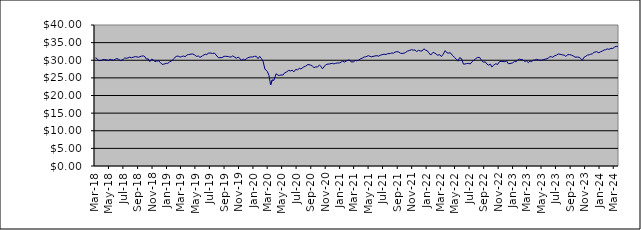
| Category | Series 0 |
|---|---|
| 2014-01-09 | 23.271 |
| 2014-01-17 | 23.331 |
| 2014-01-23 | 23.38 |
| 2014-01-31 | 23.105 |
| 2014-02-10 | 23.154 |
| 2014-02-14 | 23.363 |
| 2014-02-20 | 23.414 |
| 2014-02-28 | 23.655 |
| 2014-03-10 | 23.796 |
| 2014-03-14 | 23.57 |
| 2014-03-20 | 23.682 |
| 2014-03-26 | 23.679 |
| 2014-03-31 | 23.619 |
| 2014-04-09 | 23.552 |
| 2014-04-15 | 23.391 |
| 2014-04-24 | 23.719 |
| 2014-04-30 | 23.696 |
| 2014-05-08 | 23.728 |
| 2014-05-16 | 23.706 |
| 2014-05-22 | 23.804 |
| 2014-05-31 | 24.105 |
| 2014-06-09 | 24.218 |
| 2014-06-16 | 24.162 |
| 2014-06-20 | 24.297 |
| 2014-06-30 | 24.393 |
| 2014-07-09 | 24.436 |
| 2014-07-15 | 24.508 |
| 2014-07-22 | 24.479 |
| 2014-07-31 | 24.432 |
| 2014-08-11 | 24.205 |
| 2014-08-14 | 24.276 |
| 2014-08-21 | 24.601 |
| 2014-08-30 | 24.716 |
| 2014-09-08 | 24.748 |
| 2014-09-16 | 24.609 |
| 2014-09-23 | 24.611 |
| 2014-09-30 | 24.533 |
| 2014-10-09 | 24.479 |
| 2014-10-16 | 23.843 |
| 2014-10-23 | 24.237 |
| 2014-10-31 | 24.693 |
| 2014-11-10 | 24.904 |
| 2014-11-13 | 24.956 |
| 2014-11-20 | 25.032 |
| 2014-11-29 | 25.206 |
| 2014-12-10 | 25.24 |
| 2014-12-18 | 24.922 |
| 2014-12-23 | 25.323 |
| 2014-12-30 | 25.42 |
| 2015-01-08 | 25.041 |
| 2015-01-15 | 24.939 |
| 2015-01-30 | 25.012 |
| 2015-02-10 | 25.121 |
| 2015-02-16 | 25.514 |
| 2015-02-19 | 25.562 |
| 2015-02-28 | 25.615 |
| 2015-03-10 | 25.481 |
| 2015-03-13 | 25.451 |
| 2015-03-19 | 25.686 |
| 2015-03-27 | 25.421 |
| 2015-04-07 | 25.48 |
| 2015-04-16 | 25.815 |
| 2015-04-27 | 25.812 |
| 2015-05-08 | 25.559 |
| 2015-05-14 | 25.736 |
| 2015-05-21 | 25.948 |
| 2015-05-27 | 25.84 |
| 2015-06-03 | 25.88 |
| 2015-06-09 | 25.678 |
| 2015-06-15 | 25.796 |
| 2015-06-22 | 25.92 |
| 2015-06-26 | 25.897 |
| 2015-07-02 | 25.731 |
| 2015-07-09 | 25.768 |
| 2015-07-14 | 25.916 |
| 2015-07-23 | 26.024 |
| 2015-07-29 | 25.894 |
| 2015-08-06 | 25.982 |
| 2015-08-13 | 25.867 |
| 2015-08-20 | 25.79 |
| 2015-08-27 | 24.872 |
| 2015-09-03 | 24.924 |
| 2015-09-09 | 25.055 |
| 2015-09-15 | 24.966 |
| 2015-09-21 | 25.184 |
| 2015-09-28 | 24.748 |
| 2015-10-07 | 24.957 |
| 2015-10-13 | 25.19 |
| 2015-10-22 | 25.205 |
| 2015-10-28 | 25.519 |
| 2015-11-04 | 25.772 |
| 2015-11-13 | 25.296 |
| 2015-11-19 | 25.475 |
| 2015-11-27 | 25.452 |
| 2015-12-03 | 25.436 |
| 2015-12-10 | 25.249 |
| 2015-12-15 | 25.064 |
| 2015-12-23 | 25.225 |
| 2015-12-29 | 25.363 |
| 2016-01-07 | 24.91 |
| 2016-01-14 | 24.234 |
| 2016-01-21 | 24.038 |
| 2016-01-28 | 24.213 |
| 2016-02-04 | 24.389 |
| 2016-02-11 | 24.068 |
| 2016-02-18 | 24.581 |
| 2016-02-25 | 24.633 |
| 2016-03-03 | 25.008 |
| 2016-03-10 | 25.023 |
| 2016-03-16 | 25.203 |
| 2016-03-29 | 25.276 |
| 2016-04-07 | 25.513 |
| 2016-04-14 | 25.639 |
| 2016-04-28 | 25.733 |
| 2016-05-05 | 25.378 |
| 2016-05-12 | 25.472 |
| 2016-05-19 | 25.566 |
| 2016-05-30 | 25.852 |
| 2016-06-03 | 25.871 |
| 2016-06-09 | 25.914 |
| 2016-06-15 | 25.633 |
| 2016-06-23 | 25.685 |
| 2016-06-29 | 25.336 |
| 2016-07-11 | 25.973 |
| 2016-07-14 | 26.146 |
| 2016-07-21 | 26.315 |
| 2016-07-28 | 26.282 |
| 2016-08-04 | 26.232 |
| 2016-08-11 | 26.369 |
| 2016-08-16 | 26.446 |
| 2016-08-24 | 26.43 |
| 2016-08-30 | 26.405 |
| 2016-09-08 | 26.449 |
| 2016-09-15 | 26.011 |
| 2016-09-22 | 26.294 |
| 2016-09-29 | 26.436 |
| 2016-10-06 | 26.367 |
| 2016-10-13 | 26.225 |
| 2016-10-20 | 26.273 |
| 2016-10-28 | 26.21 |
| 2016-11-03 | 26.031 |
| 2016-11-10 | 26.452 |
| 2016-11-15 | 26.401 |
| 2016-11-23 | 26.714 |
| 2016-11-29 | 26.725 |
| 2016-12-07 | 26.77 |
| 2016-12-14 | 27.233 |
| 2016-12-21 | 27.218 |
| 2016-12-28 | 27.195 |
| 2017-01-05 | 27.275 |
| 2017-01-16 | 27.351 |
| 2017-01-23 | 27.328 |
| 2017-01-30 | 27.466 |
| 2017-02-06 | 27.517 |
| 2017-02-13 | 27.681 |
| 2017-02-20 | 27.925 |
| 2017-02-27 | 28.066 |
| 2017-03-06 | 28.154 |
| 2017-03-13 | 28.098 |
| 2017-03-20 | 28.202 |
| 2017-03-27 | 28.021 |
| 2017-03-30 | 28.173 |
| 2017-04-10 | 28.19 |
| 2017-04-18 | 28.038 |
| 2017-04-24 | 28.144 |
| 2017-04-28 | 28.365 |
| 2017-05-08 | 28.399 |
| 2017-05-15 | 28.323 |
| 2017-05-22 | 28.09 |
| 2017-05-30 | 28.401 |
| 2017-06-06 | 28.555 |
| 2017-06-12 | 28.528 |
| 2017-06-15 | 28.57 |
| 2017-06-20 | 28.676 |
| 2017-06-29 | 28.558 |
| 2017-07-04 | 28.477 |
| 2017-07-10 | 28.386 |
| 2017-07-14 | 28.554 |
| 2017-07-19 | 28.665 |
| 2017-07-24 | 28.744 |
| 2017-07-28 | 28.835 |
| 2017-08-03 | 28.856 |
| 2017-08-09 | 28.877 |
| 2017-08-14 | 28.649 |
| 2017-08-21 | 28.554 |
| 2017-08-24 | 28.679 |
| 2017-08-30 | 28.658 |
| 2017-09-07 | 28.807 |
| 2017-09-14 | 29.055 |
| 2017-09-20 | 29.151 |
| 2017-09-29 | 29.153 |
| 2017-10-05 | 29.33 |
| 2017-10-11 | 29.375 |
| 2017-10-16 | 29.416 |
| 2017-10-23 | 29.548 |
| 2017-10-30 | 29.482 |
| 2017-11-07 | 29.16 |
| 2017-11-15 | 29.111 |
| 2017-11-23 | 29.473 |
| 2017-11-29 | 29.604 |
| 2017-12-07 | 29.691 |
| 2017-12-13 | 29.879 |
| 2017-12-18 | 30.001 |
| 2017-12-28 | 30.14 |
| 2018-01-08 | 30.629 |
| 2018-01-17 | 30.875 |
| 2018-01-24 | 31.212 |
| 2018-01-30 | 31.262 |
| 2018-02-05 | 30.715 |
| 2018-02-13 | 30.076 |
| 2018-02-19 | 30.382 |
| 2018-02-27 | 30.682 |
| 2018-03-07 | 30.428 |
| 2018-03-14 | 30.666 |
| 2018-03-21 | 30.494 |
| 2018-03-29 | 29.874 |
| 2018-04-10 | 29.993 |
| 2018-04-16 | 30.209 |
| 2018-04-23 | 30.199 |
| 2018-04-27 | 30.054 |
| 2018-05-10 | 29.969 |
| 2018-05-15 | 30.286 |
| 2018-05-22 | 30.137 |
| 2018-05-30 | 30.047 |
| 2018-06-06 | 30.292 |
| 2018-06-13 | 30.478 |
| 2018-06-20 | 30.287 |
| 2018-06-29 | 29.896 |
| 2018-07-10 | 30.257 |
| 2018-07-16 | 30.649 |
| 2018-07-23 | 30.56 |
| 2018-07-30 | 30.666 |
| 2018-08-07 | 30.875 |
| 2018-08-13 | 30.705 |
| 2018-08-24 | 30.92 |
| 2018-08-30 | 31.031 |
| 2018-09-06 | 30.95 |
| 2018-09-13 | 30.847 |
| 2018-09-24 | 31.164 |
| 2018-09-28 | 31.06 |
| 2018-10-04 | 31.233 |
| 2018-10-10 | 30.934 |
| 2018-10-16 | 30.298 |
| 2018-10-23 | 30.428 |
| 2018-10-30 | 29.618 |
| 2018-11-07 | 30.312 |
| 2018-11-15 | 30.016 |
| 2018-11-21 | 29.623 |
| 2018-11-29 | 29.814 |
| 2018-12-07 | 29.8 |
| 2018-12-14 | 29.353 |
| 2018-12-21 | 28.829 |
| 2018-12-28 | 28.88 |
| 2019-01-08 | 29.142 |
| 2019-01-14 | 29.104 |
| 2019-01-21 | 29.511 |
| 2019-01-30 | 29.839 |
| 2019-02-11 | 30.559 |
| 2019-02-14 | 30.878 |
| 2019-02-21 | 31.153 |
| 2019-02-27 | 31.162 |
| 2019-03-07 | 30.893 |
| 2019-03-14 | 31.049 |
| 2019-03-21 | 31.203 |
| 2019-03-29 | 31.003 |
| 2019-04-04 | 31.479 |
| 2019-04-12 | 31.615 |
| 2019-04-18 | 31.703 |
| 2019-04-29 | 31.798 |
| 2019-05-08 | 31.489 |
| 2019-05-15 | 31.088 |
| 2019-05-23 | 31.214 |
| 2019-05-30 | 30.813 |
| 2019-06-10 | 31.287 |
| 2019-06-14 | 31.295 |
| 2019-06-21 | 31.715 |
| 2019-06-28 | 31.561 |
| 2019-07-04 | 32.055 |
| 2019-07-15 | 32.021 |
| 2019-07-22 | 31.917 |
| 2019-07-30 | 32.038 |
| 2019-08-06 | 31.478 |
| 2019-08-16 | 30.708 |
| 2019-08-22 | 30.756 |
| 2019-08-30 | 30.733 |
| 2019-09-09 | 31.107 |
| 2019-09-16 | 31.123 |
| 2019-09-20 | 31.357 |
| 2019-09-27 | 31.041 |
| 2019-10-03 | 30.905 |
| 2019-10-09 | 30.971 |
| 2019-10-15 | 31.237 |
| 2019-10-30 | 30.589 |
| 2019-11-07 | 30.886 |
| 2019-11-14 | 30.551 |
| 2019-11-21 | 29.957 |
| 2019-11-29 | 30.308 |
| 2019-12-05 | 30.076 |
| 2019-12-11 | 30.4 |
| 2019-12-17 | 30.649 |
| 2019-12-23 | 30.829 |
| 2019-12-30 | 30.923 |
| 2020-01-07 | 30.918 |
| 2020-01-15 | 31.103 |
| 2020-01-22 | 31.13 |
| 2020-01-30 | 30.46 |
| 2020-02-06 | 31.111 |
| 2020-02-14 | 30.408 |
| 2020-02-20 | 29.739 |
| 2020-02-28 | 27.507 |
| 2020-03-09 | 26.827 |
| 2020-03-16 | 25.715 |
| 2020-03-23 | 22.987 |
| 2020-03-30 | 24.426 |
| 2020-04-06 | 24.308 |
| 2020-04-15 | 26.161 |
| 2020-04-23 | 25.79 |
| 2020-04-29 | 25.681 |
| 2020-05-06 | 25.839 |
| 2020-05-14 | 25.773 |
| 2020-05-20 | 26.359 |
| 2020-05-29 | 26.678 |
| 2020-06-08 | 27.145 |
| 2020-06-15 | 26.938 |
| 2020-06-22 | 27.194 |
| 2020-06-29 | 26.698 |
| 2020-07-07 | 27.405 |
| 2020-07-15 | 27.283 |
| 2020-07-22 | 27.705 |
| 2020-07-29 | 27.528 |
| 2020-08-10 | 28.118 |
| 2020-08-17 | 28.285 |
| 2020-08-21 | 28.331 |
| 2020-08-28 | 28.81 |
| 2020-09-07 | 28.655 |
| 2020-09-15 | 28.366 |
| 2020-09-22 | 27.913 |
| 2020-09-29 | 28.106 |
| 2020-10-07 | 28.065 |
| 2020-10-15 | 28.653 |
| 2020-10-21 | 28.308 |
| 2020-10-28 | 27.578 |
| 2020-11-10 | 28.687 |
| 2020-11-16 | 28.867 |
| 2020-11-20 | 28.82 |
| 2020-11-27 | 28.957 |
| 2020-12-08 | 29.139 |
| 2020-12-15 | 28.966 |
| 2020-12-22 | 29.114 |
| 2020-12-30 | 29.234 |
| 2021-01-07 | 29.212 |
| 2021-01-15 | 29.507 |
| 2021-01-21 | 29.741 |
| 2021-01-29 | 29.487 |
| 2021-02-08 | 29.88 |
| 2021-02-15 | 30.078 |
| 2021-02-22 | 29.944 |
| 2021-02-26 | 29.513 |
| 2021-03-08 | 29.555 |
| 2021-03-15 | 29.936 |
| 2021-03-22 | 29.846 |
| 2021-03-30 | 30.048 |
| 2021-04-08 | 30.47 |
| 2021-04-15 | 30.629 |
| 2021-04-22 | 30.945 |
| 2021-04-29 | 30.98 |
| 2021-05-10 | 31.307 |
| 2021-05-17 | 31.081 |
| 2021-05-24 | 30.972 |
| 2021-05-28 | 31.152 |
| 2021-06-07 | 31.23 |
| 2021-06-15 | 31.286 |
| 2021-06-22 | 31.16 |
| 2021-06-29 | 31.404 |
| 2021-07-07 | 31.591 |
| 2021-07-15 | 31.71 |
| 2021-07-23 | 31.629 |
| 2021-07-30 | 31.863 |
| 2021-08-10 | 31.897 |
| 2021-08-17 | 32.076 |
| 2021-08-23 | 31.989 |
| 2021-08-30 | 32.31 |
| 2021-09-07 | 32.447 |
| 2021-09-15 | 32.326 |
| 2021-09-22 | 31.988 |
| 2021-09-29 | 31.945 |
| 2021-10-07 | 31.983 |
| 2021-10-15 | 32.283 |
| 2021-10-22 | 32.609 |
| 2021-10-29 | 32.745 |
| 2021-11-08 | 33.001 |
| 2021-11-15 | 32.873 |
| 2021-11-23 | 32.911 |
| 2021-11-29 | 32.46 |
| 2021-12-08 | 32.831 |
| 2021-12-15 | 32.621 |
| 2021-12-22 | 32.613 |
| 2021-12-30 | 33.233 |
| 2022-01-07 | 32.85 |
| 2022-01-14 | 32.657 |
| 2022-01-20 | 32.109 |
| 2022-01-28 | 31.48 |
| 2022-02-07 | 32.257 |
| 2022-02-14 | 32.029 |
| 2022-02-21 | 31.731 |
| 2022-02-25 | 31.425 |
| 2022-03-07 | 31.566 |
| 2022-03-14 | 31.053 |
| 2022-03-21 | 31.658 |
| 2022-03-30 | 32.727 |
| 2022-04-07 | 32.084 |
| 2022-04-14 | 32.033 |
| 2022-04-21 | 32.136 |
| 2022-04-29 | 31.424 |
| 2022-05-09 | 30.753 |
| 2022-05-16 | 30.337 |
| 2022-05-23 | 29.733 |
| 2022-05-30 | 30.742 |
| 2022-06-07 | 30.45 |
| 2022-06-15 | 28.907 |
| 2022-06-22 | 28.929 |
| 2022-06-29 | 29.065 |
| 2022-07-07 | 29.109 |
| 2022-07-14 | 28.952 |
| 2022-07-21 | 29.581 |
| 2022-07-29 | 30.013 |
| 2022-08-05 | 30.385 |
| 2022-08-12 | 30.756 |
| 2022-08-22 | 30.819 |
| 2022-08-30 | 30.002 |
| 2022-09-07 | 29.443 |
| 2022-09-15 | 29.564 |
| 2022-09-22 | 28.926 |
| 2022-09-29 | 28.604 |
| 2022-10-07 | 28.898 |
| 2022-10-13 | 28.092 |
| 2022-10-20 | 28.556 |
| 2022-10-28 | 28.974 |
| 2022-11-07 | 28.839 |
| 2022-11-14 | 29.604 |
| 2022-11-21 | 29.658 |
| 2022-11-29 | 29.639 |
| 2022-12-07 | 29.558 |
| 2022-12-14 | 29.867 |
| 2022-12-21 | 29.037 |
| 2022-12-29 | 29.066 |
| 2023-01-09 | 29.263 |
| 2023-01-16 | 29.662 |
| 2023-01-23 | 29.591 |
| 2023-01-30 | 30.027 |
| 2023-02-06 | 30.34 |
| 2023-02-13 | 30.184 |
| 2023-02-20 | 30.152 |
| 2023-02-27 | 29.712 |
| 2023-03-09 | 29.791 |
| 2023-03-16 | 29.334 |
| 2023-03-23 | 29.766 |
| 2023-03-30 | 29.615 |
| 2023-04-06 | 30.038 |
| 2023-04-13 | 30.039 |
| 2023-04-20 | 30.261 |
| 2023-04-28 | 30.096 |
| 2023-05-04 | 30.024 |
| 2023-05-11 | 30.047 |
| 2023-05-18 | 30.168 |
| 2023-05-30 | 30.362 |
| 2023-06-08 | 30.616 |
| 2023-06-15 | 31.002 |
| 2023-06-22 | 30.984 |
| 2023-06-27 | 30.843 |
| 2023-07-06 | 31.313 |
| 2023-07-13 | 31.438 |
| 2023-07-20 | 31.783 |
| 2023-07-28 | 31.706 |
| 2023-08-07 | 31.524 |
| 2023-08-14 | 31.471 |
| 2023-08-21 | 31.112 |
| 2023-08-30 | 31.597 |
| 2023-09-07 | 31.593 |
| 2023-09-14 | 31.433 |
| 2023-09-21 | 31.25 |
| 2023-09-29 | 30.876 |
| 2023-10-09 | 30.901 |
| 2023-10-16 | 30.852 |
| 2023-10-23 | 30.506 |
| 2023-10-30 | 30.009 |
| 2023-11-06 | 30.859 |
| 2023-11-13 | 31.093 |
| 2023-11-20 | 31.443 |
| 2023-11-29 | 31.572 |
| 2023-12-04 | 31.727 |
| 2023-12-11 | 31.801 |
| 2023-12-18 | 32.237 |
| 2023-12-29 | 32.444 |
| 2024-01-08 | 32.11 |
| 2024-01-15 | 32.417 |
| 2024-01-22 | 32.606 |
| 2024-01-30 | 32.921 |
| 2024-02-05 | 32.979 |
| 2024-02-12 | 33.219 |
| 2024-02-19 | 33.097 |
| 2024-02-28 | 33.352 |
| 2024-03-07 | 33.371 |
| 2024-03-14 | 33.74 |
| 2024-03-21 | 33.96 |
| 2024-03-28 | 33.867 |